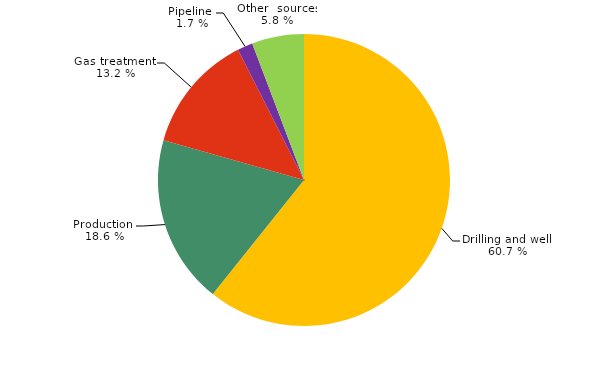
| Category | Series 0 |
|---|---|
| Drilling and well  | 86.818 |
| Production  | 26.657 |
| Gas treatment  | 18.797 |
| Pipeline  | 2.423 |
| Other  sources | 8.246 |